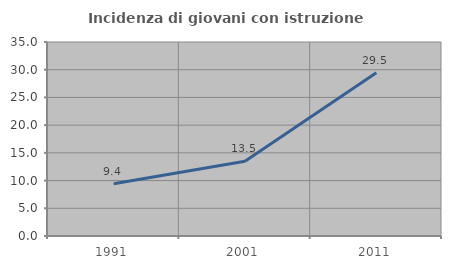
| Category | Incidenza di giovani con istruzione universitaria |
|---|---|
| 1991.0 | 9.412 |
| 2001.0 | 13.483 |
| 2011.0 | 29.464 |